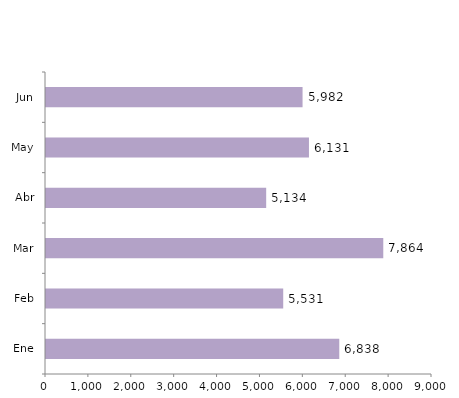
| Category | Series 0 |
|---|---|
| Ene | 6838 |
| Feb | 5531 |
| Mar | 7864 |
| Abr | 5134 |
| May | 6131 |
| Jun | 5982 |